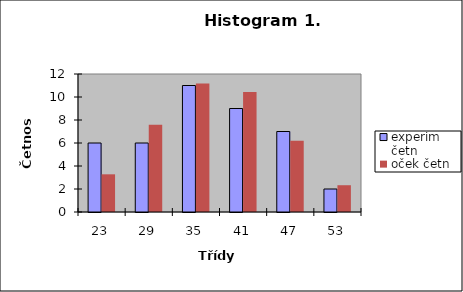
| Category | experim četn | oček četn |
|---|---|---|
| 23.0 | 6 | 3.278 |
| 29.0 | 6 | 7.596 |
| 35.0 | 11 | 11.174 |
| 41.0 | 9 | 10.436 |
| 47.0 | 7 | 6.188 |
| 53.0 | 2 | 2.329 |